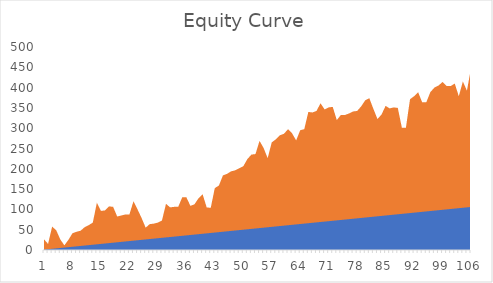
| Category | Cumulative Profit/Loss (C) | Trade |
|---|---|---|
| 0 | 26.25 | 1 |
| 1 | 15 | 2 |
| 2 | 57.5 | 3 |
| 3 | 48.75 | 4 |
| 4 | 26.25 | 5 |
| 5 | 11.25 | 6 |
| 6 | 25 | 7 |
| 7 | 41.25 | 8 |
| 8 | 45 | 9 |
| 9 | 47.5 | 10 |
| 10 | 56.25 | 11 |
| 11 | 61.25 | 12 |
| 12 | 67.5 | 13 |
| 13 | 116.25 | 14 |
| 14 | 96.25 | 15 |
| 15 | 97.5 | 16 |
| 16 | 107.5 | 17 |
| 17 | 106.25 | 18 |
| 18 | 82.5 | 19 |
| 19 | 85 | 20 |
| 20 | 87.5 | 21 |
| 21 | 87.5 | 22 |
| 22 | 120 | 23 |
| 23 | 100 | 24 |
| 24 | 78.75 | 25 |
| 25 | 55 | 26 |
| 26 | 63.75 | 27 |
| 27 | 65 | 28 |
| 28 | 67.5 | 29 |
| 29 | 72.5 | 30 |
| 30 | 113.75 | 31 |
| 31 | 105 | 32 |
| 32 | 106.25 | 33 |
| 33 | 106.25 | 34 |
| 34 | 130 | 35 |
| 35 | 130 | 36 |
| 36 | 108.75 | 37 |
| 37 | 112.5 | 38 |
| 38 | 127.5 | 39 |
| 39 | 137.5 | 40 |
| 40 | 105 | 41 |
| 41 | 103.75 | 42 |
| 42 | 152.5 | 43 |
| 43 | 158.75 | 44 |
| 44 | 183.75 | 45 |
| 45 | 187.5 | 46 |
| 46 | 193.75 | 47 |
| 47 | 196.25 | 48 |
| 48 | 201.25 | 49 |
| 49 | 206.25 | 50 |
| 50 | 223.75 | 51 |
| 51 | 235 | 52 |
| 52 | 236.25 | 53 |
| 53 | 268.75 | 54 |
| 54 | 251.25 | 55 |
| 55 | 226.25 | 56 |
| 56 | 265 | 57 |
| 57 | 272.5 | 58 |
| 58 | 282.5 | 59 |
| 59 | 286.25 | 60 |
| 60 | 297.5 | 61 |
| 61 | 287.5 | 62 |
| 62 | 270 | 63 |
| 63 | 295 | 64 |
| 64 | 297.5 | 65 |
| 65 | 340 | 66 |
| 66 | 338.75 | 67 |
| 67 | 342.5 | 68 |
| 68 | 361.25 | 69 |
| 69 | 346.25 | 70 |
| 70 | 351.25 | 71 |
| 71 | 352.5 | 72 |
| 72 | 320 | 73 |
| 73 | 332.5 | 74 |
| 74 | 332.5 | 75 |
| 75 | 336.25 | 76 |
| 76 | 341.25 | 77 |
| 77 | 342.5 | 78 |
| 78 | 353.75 | 79 |
| 79 | 368.75 | 80 |
| 80 | 373.75 | 81 |
| 81 | 347.5 | 82 |
| 82 | 322.5 | 83 |
| 83 | 333.75 | 84 |
| 84 | 355 | 85 |
| 85 | 348.75 | 86 |
| 86 | 351.25 | 87 |
| 87 | 350 | 88 |
| 88 | 301.25 | 89 |
| 89 | 301.25 | 90 |
| 90 | 371.25 | 91 |
| 91 | 378.75 | 92 |
| 92 | 388.75 | 93 |
| 93 | 363.75 | 94 |
| 94 | 363.75 | 95 |
| 95 | 388.75 | 96 |
| 96 | 400 | 97 |
| 97 | 405 | 98 |
| 98 | 413.75 | 99 |
| 99 | 403.75 | 100 |
| 100 | 403.75 | 101 |
| 101 | 410 | 102 |
| 102 | 378.75 | 103 |
| 103 | 415 | 104 |
| 104 | 392.5 | 105 |
| 105 | 447.5 | 106 |